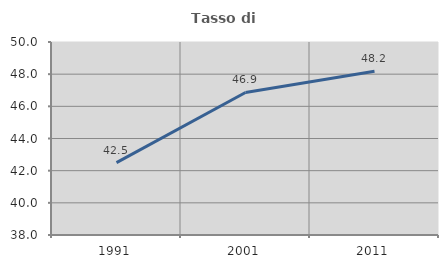
| Category | Tasso di occupazione   |
|---|---|
| 1991.0 | 42.502 |
| 2001.0 | 46.863 |
| 2011.0 | 48.183 |